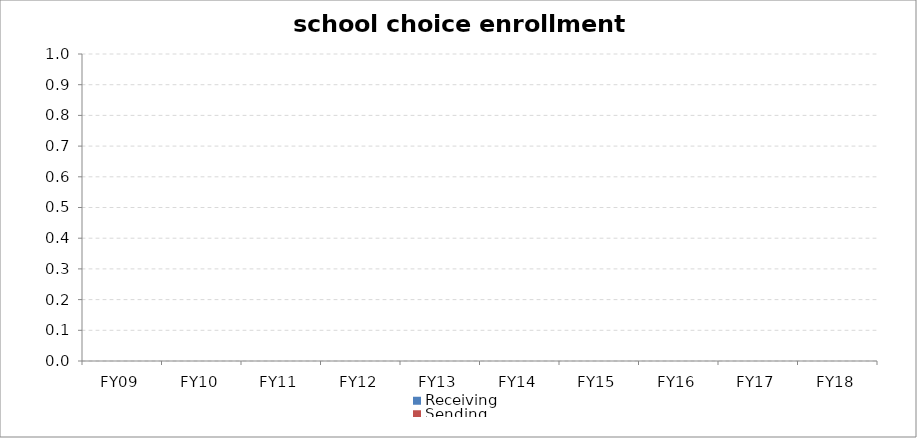
| Category | Receiving | Sending |
|---|---|---|
| FY09 | 0 | 0 |
| FY10 | 0 | 0 |
| FY11 | 0 | 0 |
| FY12 | 0 | 0 |
| FY13 | 0 | 0 |
| FY14 | 0 | 0 |
| FY15 | 0 | 0 |
| FY16 | 0 | 0 |
| FY17 | 0 | 0 |
| FY18 | 0 | 0 |